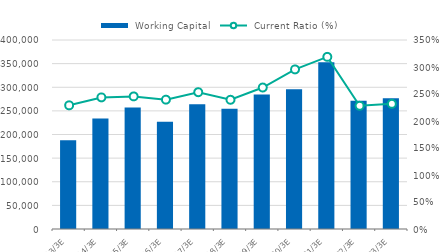
| Category |  Working Capital |
|---|---|
| 2013-03-31 | 187993 |
| 2014-03-31 | 233786 |
| 2015-03-31 | 257334 |
| 2016-03-31 | 226946 |
| 2017-03-31 | 263823 |
| 2018-03-31 | 254607 |
| 2019-03-31 | 284418 |
| 2020-03-31 | 295840 |
| 2021-03-31 | 353062 |
| 2022-03-31 | 271233 |
| 2023-03-31 | 276872 |